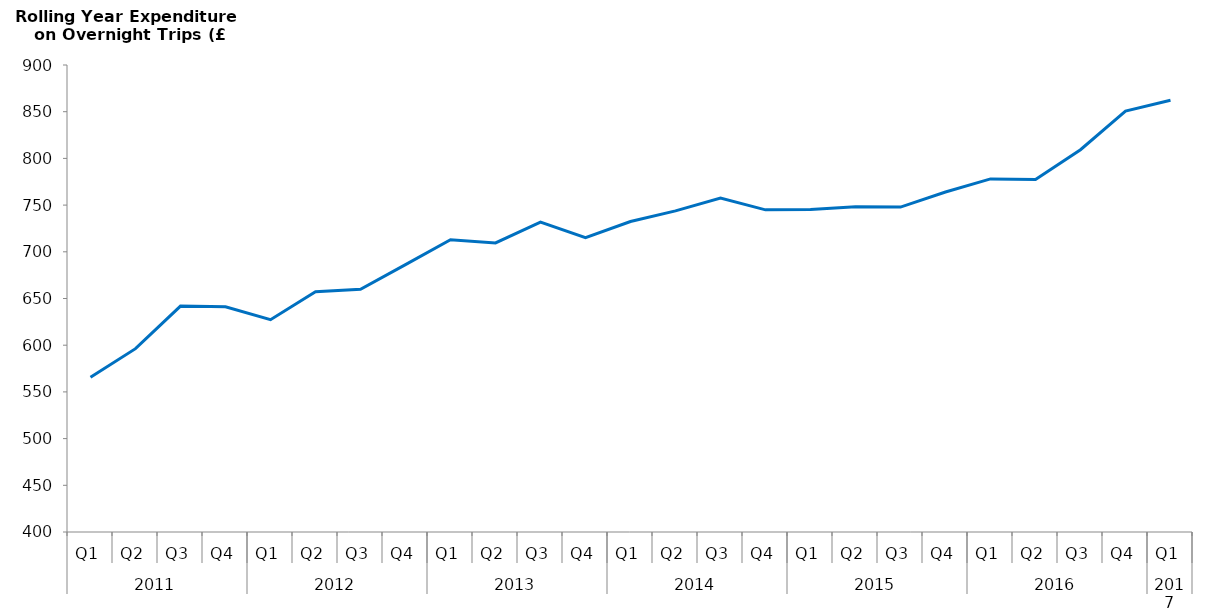
| Category | Rolling Year Expenditure during Overnight Trips (£) |
|---|---|
| 0 | 565729554.001 |
| 1 | 596312192.593 |
| 2 | 641866557.5 |
| 3 | 641047679.387 |
| 4 | 627323887.721 |
| 5 | 657242377.112 |
| 6 | 659852225.798 |
| 7 | 686321849.941 |
| 8 | 712983579.382 |
| 9 | 709441918.473 |
| 10 | 731788868.702 |
| 11 | 715190933.753 |
| 12 | 732440715.999 |
| 13 | 743830056.838 |
| 14 | 757659736.92 |
| 15 | 744902295.731 |
| 16 | 745261550.624 |
| 17 | 748317146.573 |
| 18 | 747907058.216 |
| 19 | 764066271.956 |
| 20 | 778038524.364 |
| 21 | 777511283.851 |
| 22 | 809333487.806 |
| 23 | 850707667.923 |
| 24 | 862269362.203 |